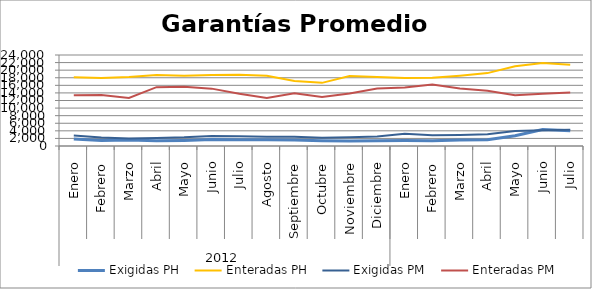
| Category | Exigidas PH | Enteradas PH | Exigidas PM | Enteradas PM |
|---|---|---|---|---|
| 0 | 1828.564 | 18155.583 | 2744.93 | 13413.991 |
| 1 | 1451.155 | 17917.734 | 2215.902 | 13440.832 |
| 2 | 1587.31 | 18166.129 | 1968.766 | 12673.714 |
| 3 | 1353.003 | 18741.256 | 2118.782 | 15515.723 |
| 4 | 1464.668 | 18540.927 | 2278.002 | 15625.393 |
| 5 | 1719.43 | 18734.539 | 2626.915 | 15127.903 |
| 6 | 1674.023 | 18761.463 | 2556.575 | 13766.49 |
| 7 | 1647.243 | 18544.546 | 2463.76 | 12637.427 |
| 8 | 1556.152 | 17124.972 | 2459.803 | 13929.715 |
| 9 | 1402.926 | 16653.067 | 2169.047 | 12937.81 |
| 10 | 1329.011 | 18467.462 | 2322.009 | 13825.53 |
| 11 | 1379.519 | 18204.98 | 2522.413 | 15188.776 |
| 12 | 1462.675 | 17957.148 | 3246.817 | 15415.235 |
| 13 | 1398.609 | 17993.637 | 2845.352 | 16230.589 |
| 14 | 1589.589 | 18548.479 | 2894.834 | 15192.36 |
| 15 | 1623.519 | 19220.98 | 3086.854 | 14555.102 |
| 16 | 2700.009 | 21053.59 | 3968.296 | 13386.678 |
| 17 | 4335.591 | 21872.028 | 4126.324 | 13759.513 |
| 18 | 4053.78 | 21401.693 | 4283.155 | 14110.316 |